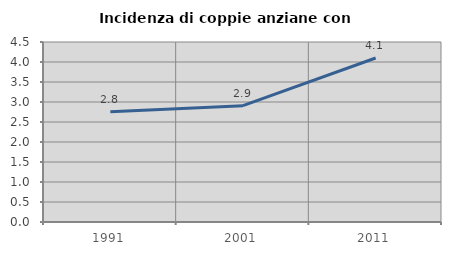
| Category | Incidenza di coppie anziane con figli |
|---|---|
| 1991.0 | 2.756 |
| 2001.0 | 2.908 |
| 2011.0 | 4.1 |